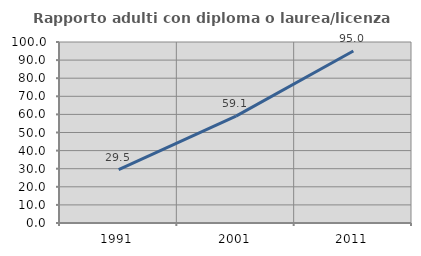
| Category | Rapporto adulti con diploma o laurea/licenza media  |
|---|---|
| 1991.0 | 29.478 |
| 2001.0 | 59.072 |
| 2011.0 | 95.045 |